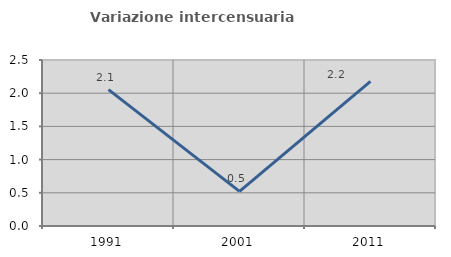
| Category | Variazione intercensuaria annua |
|---|---|
| 1991.0 | 2.054 |
| 2001.0 | 0.521 |
| 2011.0 | 2.179 |